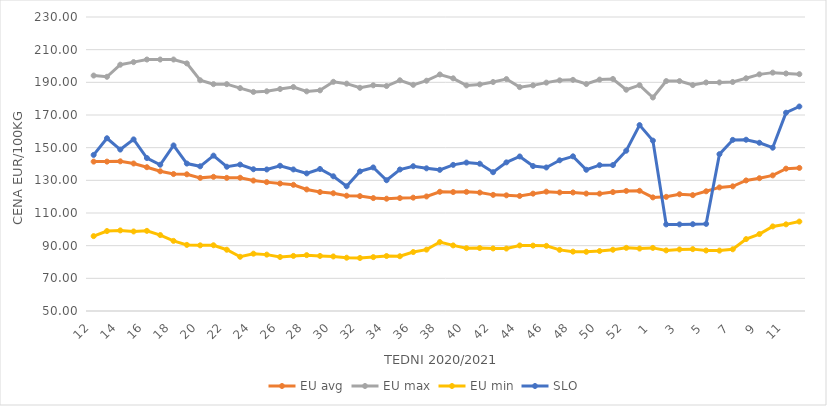
| Category | EU avg | EU max | EU min | SLO |
|---|---|---|---|---|
| 12.0 | 141.467 | 194.15 | 95.845 | 145.57 |
| 13.0 | 141.466 | 193.4 | 98.945 | 155.76 |
| 14.0 | 141.645 | 200.79 | 99.347 | 148.84 |
| 15.0 | 140.306 | 202.38 | 98.696 | 155.07 |
| 16.0 | 138.046 | 203.97 | 99.065 | 143.65 |
| 17.0 | 135.556 | 203.97 | 96.499 | 139.55 |
| 18.0 | 133.857 | 203.97 | 92.931 | 151.36 |
| 19.0 | 133.702 | 201.59 | 90.48 | 140.27 |
| 20.0 | 131.51 | 191.27 | 90.199 | 138.59 |
| 21.0 | 132.157 | 188.89 | 90.255 | 145.12 |
| 22.0 | 131.509 | 188.89 | 87.513 | 138.33 |
| 23.0 | 131.578 | 186.47 | 83.199 | 139.64 |
| 24.0 | 129.861 | 184.13 | 85.09 | 136.79 |
| 25.0 | 128.899 | 184.51 | 84.52 | 136.65 |
| 26.0 | 128.034 | 185.91 | 83.06 | 138.92 |
| 27.0 | 127.242 | 187.11 | 83.73 | 136.67 |
| 28.0 | 124.426 | 184.46 | 84.2 | 134.25 |
| 29.0 | 122.822 | 185.09 | 83.72 | 136.94 |
| 30.0 | 122.086 | 190.31 | 83.4 | 132.48 |
| 31.0 | 120.581 | 189.19 | 82.63 | 126.34 |
| 32.0 | 120.341 | 186.67 | 82.46 | 135.48 |
| 33.0 | 119.127 | 188.18 | 82.99 | 137.89 |
| 34.0 | 118.75 | 187.74 | 83.66 | 130.07 |
| 35.0 | 119.136 | 191.25 | 83.53 | 136.63 |
| 36.0 | 119.398 | 188.47 | 86.09 | 138.64 |
| 37.0 | 120.135 | 190.99 | 87.57 | 137.35 |
| 38.0 | 122.982 | 194.8 | 92.21 | 136.42 |
| 39.0 | 122.832 | 192.45 | 90.16 | 139.46 |
| 40.0 | 122.936 | 188.11 | 88.45 | 140.87 |
| 41.0 | 122.507 | 188.73 | 88.54 | 140.18 |
| 42.0 | 121.098 | 190.2 | 88.3 | 134.98 |
| 43.0 | 120.822 | 191.99 | 88.22 | 141 |
| 44.0 | 120.448 | 187.06 | 90.13 | 144.61 |
| 45.0 | 121.843 | 188.15 | 90.04 | 138.73 |
| 46.0 | 123.07 | 189.82 | 89.89 | 137.88 |
| 47.0 | 122.58 | 191.22 | 87.43 | 142.27 |
| 48.0 | 122.553 | 191.52 | 86.35 | 144.69 |
| 49.0 | 121.893 | 188.97 | 86.24 | 136.47 |
| 50.0 | 121.851 | 191.67 | 86.72 | 139.29 |
| 51.0 | 122.8 | 192.06 | 87.5 | 139.35 |
| 52.0 | 123.52 | 185.468 | 88.67 | 148.16 |
| 53.0 | 123.611 | 188.25 | 88.23 | 163.81 |
| 1.0 | 119.553 | 180.72 | 88.64 | 154.31 |
| 2.0 | 119.893 | 190.77 | 87.1 | 103.02 |
| 3.0 | 121.489 | 190.76 | 87.7 | 103.03 |
| 4.0 | 120.954 | 188.33 | 87.88 | 103.15 |
| 5.0 | 123.293 | 189.91 | 87.04 | 103.34 |
| 6.0 | 125.679 | 189.94 | 86.97 | 146.03 |
| 7.0 | 126.326 | 190.21 | 87.79 | 154.77 |
| 8.0 | 129.933 | 192.48 | 94.02 | 154.86 |
| 9.0 | 131.295 | 194.884 | 97.12 | 153 |
| 10.0 | 133.026 | 195.94 | 101.79 | 149.98 |
| 11.0 | 137.152 | 195.419 | 103.05 | 171.4 |
| 12.0 | 137.599 | 195.013 | 104.76 | 175.2 |